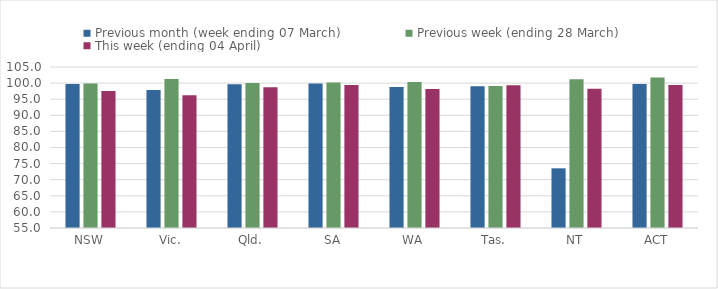
| Category | Previous month (week ending 07 March) | Previous week (ending 28 March) | This week (ending 04 April) |
|---|---|---|---|
| NSW | 99.733 | 99.886 | 97.561 |
| Vic. | 97.887 | 101.259 | 96.208 |
| Qld. | 99.645 | 100 | 98.726 |
| SA | 99.856 | 100.216 | 99.425 |
| WA | 98.791 | 100.345 | 98.158 |
| Tas. | 99.04 | 99.136 | 99.328 |
| NT | 73.529 | 101.176 | 98.235 |
| ACT | 99.704 | 101.775 | 99.408 |